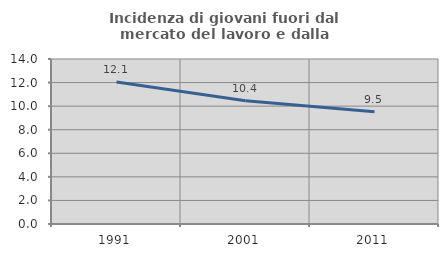
| Category | Incidenza di giovani fuori dal mercato del lavoro e dalla formazione  |
|---|---|
| 1991.0 | 12.057 |
| 2001.0 | 10.45 |
| 2011.0 | 9.531 |